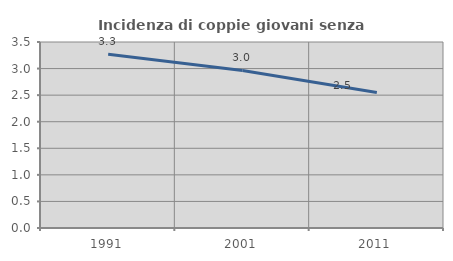
| Category | Incidenza di coppie giovani senza figli |
|---|---|
| 1991.0 | 3.27 |
| 2001.0 | 2.965 |
| 2011.0 | 2.55 |